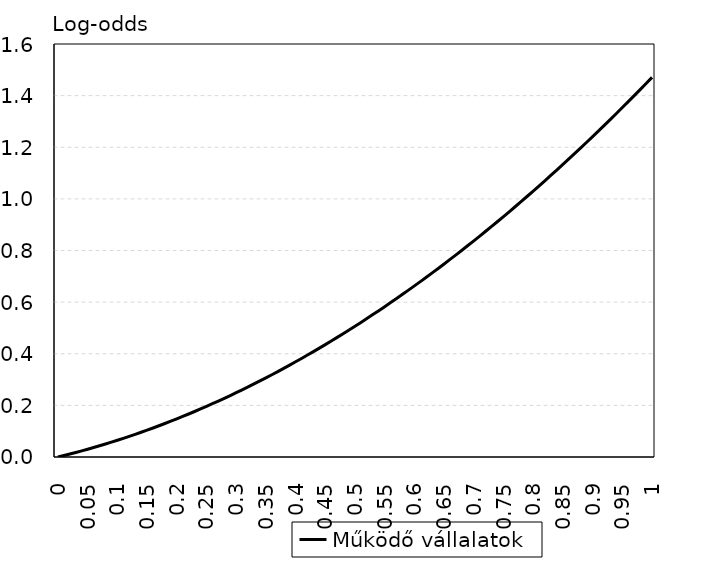
| Category | Működő vállalatok |
|---|---|
| 0.0 | 0 |
| 0.01 | 0.006 |
| 0.02 | 0.011 |
| 0.03 | 0.018 |
| 0.04 | 0.024 |
| 0.05 | 0.03 |
| 0.06 | 0.037 |
| 0.07 | 0.043 |
| 0.08 | 0.05 |
| 0.09 | 0.057 |
| 0.1 | 0.065 |
| 0.11 | 0.072 |
| 0.12 | 0.08 |
| 0.13 | 0.088 |
| 0.14 | 0.096 |
| 0.15 | 0.104 |
| 0.16 | 0.112 |
| 0.17 | 0.121 |
| 0.18 | 0.13 |
| 0.19 | 0.139 |
| 0.2 | 0.148 |
| 0.21 | 0.157 |
| 0.22 | 0.167 |
| 0.23 | 0.176 |
| 0.24 | 0.186 |
| 0.25 | 0.196 |
| 0.26 | 0.206 |
| 0.27 | 0.217 |
| 0.28 | 0.227 |
| 0.29 | 0.238 |
| 0.3 | 0.249 |
| 0.31 | 0.26 |
| 0.32 | 0.272 |
| 0.33 | 0.283 |
| 0.34 | 0.295 |
| 0.35 | 0.307 |
| 0.36 | 0.319 |
| 0.37 | 0.331 |
| 0.38 | 0.343 |
| 0.39 | 0.356 |
| 0.4 | 0.369 |
| 0.41 | 0.382 |
| 0.42 | 0.395 |
| 0.43 | 0.408 |
| 0.44 | 0.422 |
| 0.45 | 0.435 |
| 0.46 | 0.449 |
| 0.47 | 0.463 |
| 0.48 | 0.478 |
| 0.49 | 0.492 |
| 0.5 | 0.507 |
| 0.51 | 0.521 |
| 0.52 | 0.536 |
| 0.53 | 0.552 |
| 0.54 | 0.567 |
| 0.55 | 0.583 |
| 0.56 | 0.598 |
| 0.57 | 0.614 |
| 0.58 | 0.63 |
| 0.59 | 0.646 |
| 0.6 | 0.663 |
| 0.61 | 0.68 |
| 0.62 | 0.696 |
| 0.63 | 0.713 |
| 0.64 | 0.731 |
| 0.65 | 0.748 |
| 0.66 | 0.765 |
| 0.67 | 0.783 |
| 0.68 | 0.801 |
| 0.69 | 0.819 |
| 0.7 | 0.837 |
| 0.71 | 0.856 |
| 0.72 | 0.875 |
| 0.73 | 0.893 |
| 0.74 | 0.912 |
| 0.75 | 0.932 |
| 0.76 | 0.951 |
| 0.77 | 0.97 |
| 0.78 | 0.99 |
| 0.79 | 1.01 |
| 0.8 | 1.03 |
| 0.81 | 1.051 |
| 0.82 | 1.071 |
| 0.83 | 1.092 |
| 0.84 | 1.112 |
| 0.85 | 1.134 |
| 0.86 | 1.155 |
| 0.87 | 1.176 |
| 0.88 | 1.198 |
| 0.89 | 1.219 |
| 0.9 | 1.241 |
| 0.91 | 1.263 |
| 0.92 | 1.286 |
| 0.93 | 1.308 |
| 0.94 | 1.331 |
| 0.95 | 1.354 |
| 0.96 | 1.377 |
| 0.97 | 1.4 |
| 0.98 | 1.423 |
| 0.99 | 1.447 |
| 1.0 | 1.471 |